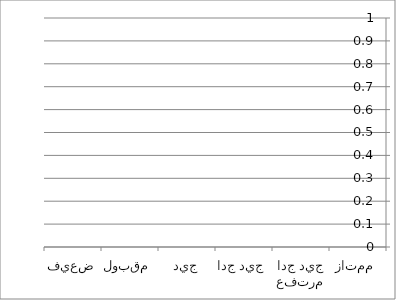
| Category | Series 0 |
|---|---|
| ممتاز | 0 |
| جيد جدا مرتفع | 0 |
| جيد جدا | 0 |
| جيد | 0 |
| مقبول | 0 |
| ضعيف | 0 |